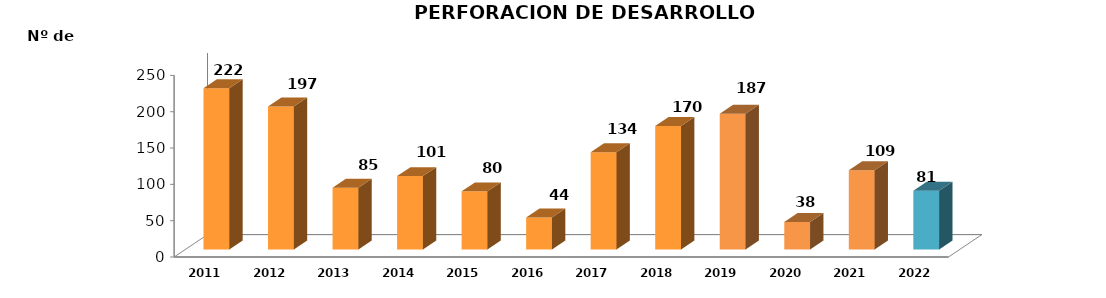
| Category | Series 0 |
|---|---|
| 2011.0 | 222 |
| 2012.0 | 197 |
| 2013.0 | 85 |
| 2014.0 | 101 |
| 2015.0 | 80 |
| 2016.0 | 44 |
| 2017.0 | 134 |
| 2018.0 | 170 |
| 2019.0 | 187 |
| 2020.0 | 38 |
| 2021.0 | 109 |
| 2022.0 | 81 |